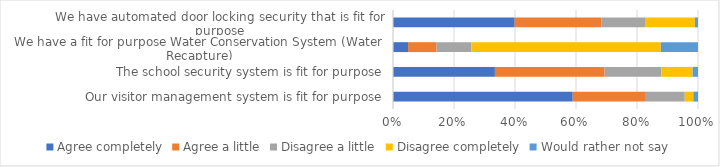
| Category | Agree completely | Agree a little | Disagree a little | Disagree completely | Would rather not say |
|---|---|---|---|---|---|
| Our visitor management system is fit for purpose | 0.589 | 0.24 | 0.128 | 0.028 | 0.015 |
| The school security system is fit for purpose | 0.334 | 0.36 | 0.186 | 0.102 | 0.018 |
| We have a fit for purpose Water Conservation System (Water Recapture) | 0.049 | 0.094 | 0.114 | 0.621 | 0.122 |
| We have automated door locking security that is fit for purpose | 0.399 | 0.284 | 0.146 | 0.161 | 0.01 |